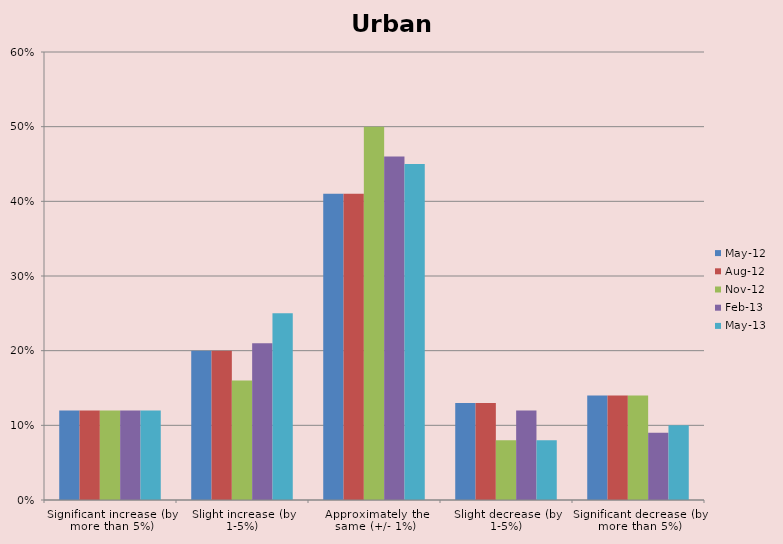
| Category | May-12 | Aug-12 | Nov-12 | Feb-13 | May-13 |
|---|---|---|---|---|---|
| Significant increase (by more than 5%) | 0.12 | 0.12 | 0.12 | 0.12 | 0.12 |
| Slight increase (by 1-5%) | 0.2 | 0.2 | 0.16 | 0.21 | 0.25 |
| Approximately the same (+/- 1%) | 0.41 | 0.41 | 0.5 | 0.46 | 0.45 |
| Slight decrease (by 1-5%) | 0.13 | 0.13 | 0.08 | 0.12 | 0.08 |
| Significant decrease (by more than 5%) | 0.14 | 0.14 | 0.14 | 0.09 | 0.1 |